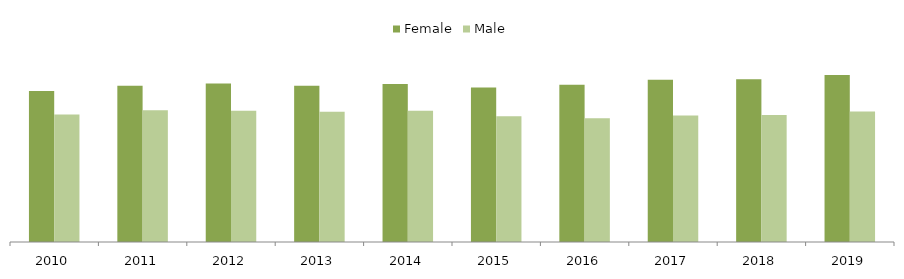
| Category | Female | Male |
|---|---|---|
| 2010 | 5229 | 4421 |
| 2011 | 5411 | 4569 |
| 2012 | 5493 | 4551 |
| 2013 | 5416 | 4513 |
| 2014 | 5471 | 4550 |
| 2015 | 5352 | 4361 |
| 2016 | 5449 | 4285 |
| 2017 | 5626 | 4380 |
| 2018 | 5637 | 4398 |
| 2019 | 5790 | 4524 |